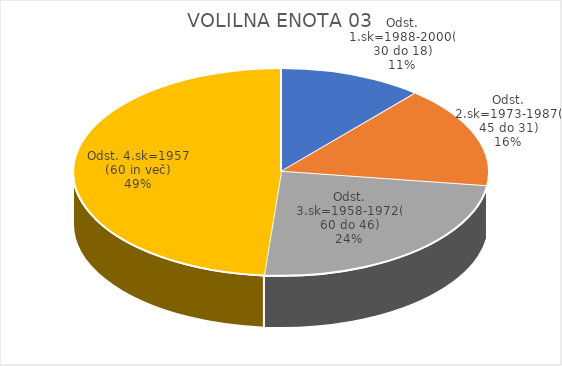
| Category | VOLILNA ENOTA 03 |
|---|---|
| Odst. 1.sk=1988-2000(30 do 18) | 1.9 |
| Odst. 2.sk=1973-1987(45 do 31) | 2.69 |
| Odst. 3.sk=1958-1972(60 do 46) | 4.06 |
| Odst. 4.sk=1957 (60 in več) | 8.21 |